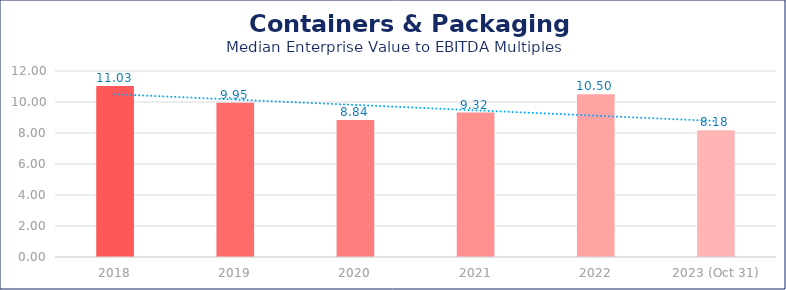
| Category | Containers & Packaging |
|---|---|
| 2018 | 11.03 |
| 2019 | 9.95 |
| 2020 | 8.84 |
| 2021 | 9.32 |
| 2022 | 10.5 |
| 2023 (Oct 31) | 8.18 |